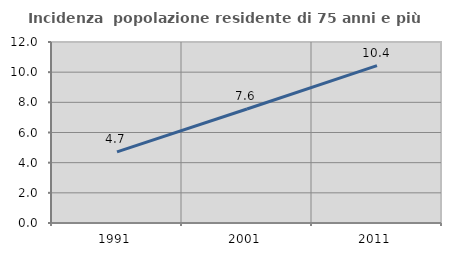
| Category | Incidenza  popolazione residente di 75 anni e più |
|---|---|
| 1991.0 | 4.715 |
| 2001.0 | 7.558 |
| 2011.0 | 10.431 |